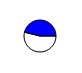
| Category | Series 0 |
|---|---|
| 0 | 30522 |
| 1 | 26206 |